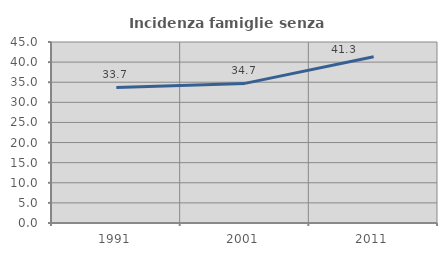
| Category | Incidenza famiglie senza nuclei |
|---|---|
| 1991.0 | 33.694 |
| 2001.0 | 34.707 |
| 2011.0 | 41.342 |